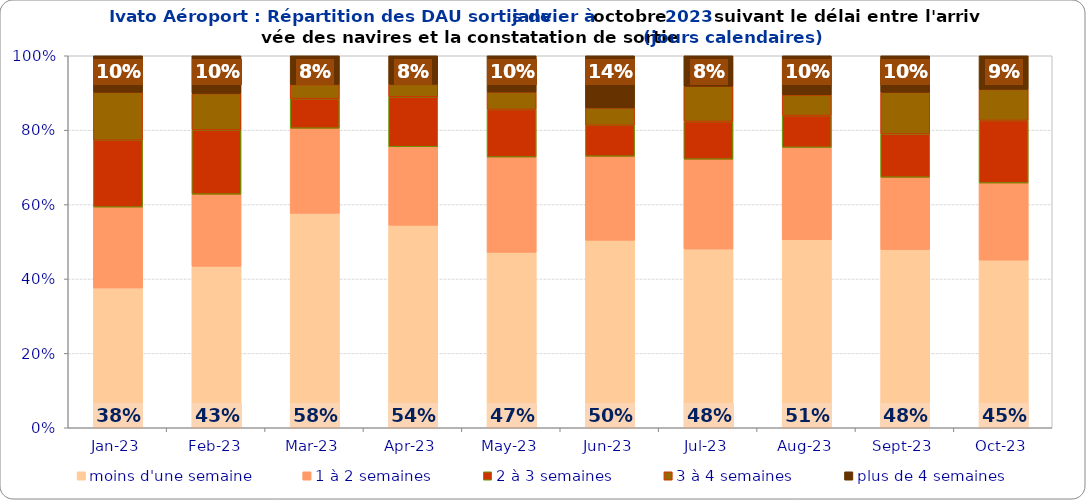
| Category | moins d'une semaine | 1 à 2 semaines | 2 à 3 semaines | 3 à 4 semaines | plus de 4 semaines |
|---|---|---|---|---|---|
| 2023-01-01 | 0.376 | 0.217 | 0.18 | 0.129 | 0.098 |
| 2023-02-01 | 0.434 | 0.194 | 0.173 | 0.098 | 0.102 |
| 2023-03-01 | 0.577 | 0.229 | 0.08 | 0.038 | 0.078 |
| 2023-04-01 | 0.544 | 0.211 | 0.134 | 0.034 | 0.077 |
| 2023-05-01 | 0.472 | 0.256 | 0.128 | 0.047 | 0.098 |
| 2023-06-01 | 0.504 | 0.226 | 0.083 | 0.047 | 0.14 |
| 2023-07-01 | 0.481 | 0.241 | 0.101 | 0.095 | 0.082 |
| 2023-08-01 | 0.505 | 0.248 | 0.086 | 0.056 | 0.105 |
| 2023-09-01 | 0.479 | 0.194 | 0.116 | 0.112 | 0.098 |
| 2023-10-01 | 0.451 | 0.207 | 0.168 | 0.083 | 0.09 |